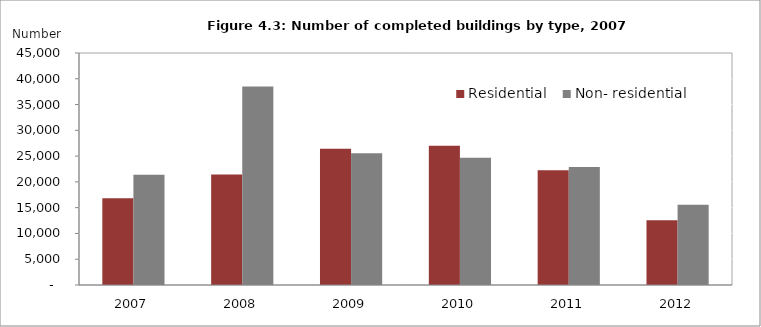
| Category | Residential | Non- residential |
|---|---|---|
| 2007.0 | 16811 | 21401 |
| 2008.0 | 21444.4 | 38494.69 |
| 2009.0 | 26411 | 25575 |
| 2010.0 | 27026.71 | 24698.33 |
| 2011.0 | 22251.04 | 22871.14 |
| 2012.0 | 12556 | 15560 |